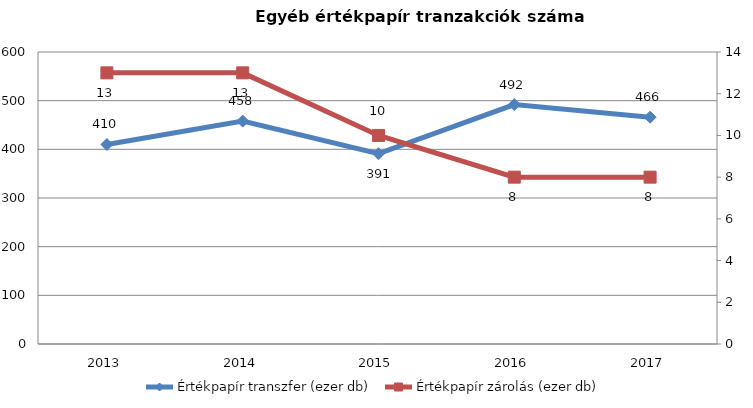
| Category | Értékpapír transzfer (ezer db) |
|---|---|
| 2013.0 | 410 |
| 2014.0 | 458 |
| 2015.0 | 391 |
| 2016.0 | 492 |
| 2017.0 | 466 |